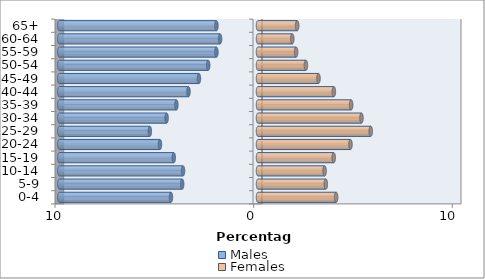
| Category | Males | Females |
|---|---|---|
| 0-4 | -4.381 | 3.932 |
| 5-9 | -3.818 | 3.413 |
| 10-14 | -3.774 | 3.352 |
| 15-19 | -4.24 | 3.809 |
| 20-24 | -4.935 | 4.654 |
| 25-29 | -5.446 | 5.674 |
| 30-34 | -4.601 | 5.208 |
| 35-39 | -4.108 | 4.689 |
| 40-44 | -3.501 | 3.818 |
| 45-49 | -2.974 | 3.044 |
| 50-54 | -2.507 | 2.41 |
| 55-59 | -2.094 | 1.918 |
| 60-64 | -1.909 | 1.724 |
| 65+ | -2.094 | 1.971 |